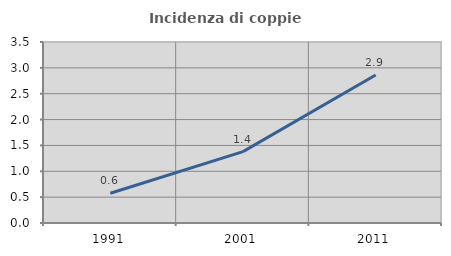
| Category | Incidenza di coppie miste |
|---|---|
| 1991.0 | 0.575 |
| 2001.0 | 1.379 |
| 2011.0 | 2.863 |